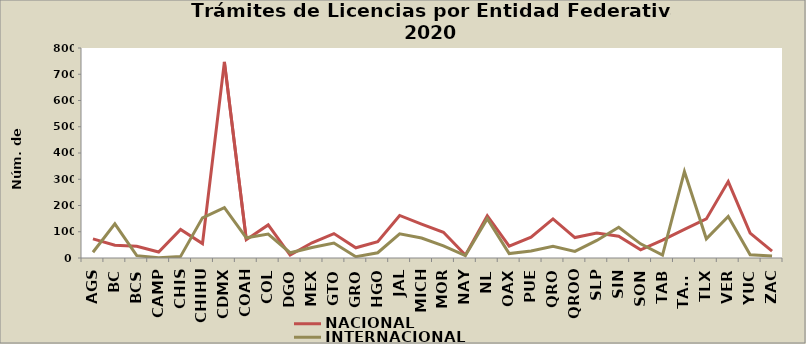
| Category | NACIONAL | INTERNACIONAL |
|---|---|---|
| AGS | 73 | 22 |
| BC | 49 | 130 |
| BCS | 45 | 9 |
| CAMP | 23 | 1 |
| CHIS | 109 | 6 |
| CHIHU | 55 | 153 |
| CDMX | 747 | 192 |
| COAH | 70 | 77 |
| COL | 126 | 91 |
| DGO | 11 | 20 |
| MEX | 58 | 40 |
| GTO | 93 | 57 |
| GRO | 39 | 5 |
| HGO | 62 | 20 |
| JAL | 162 | 92 |
| MICH | 129 | 76 |
| MOR | 98 | 46 |
| NAY | 11 | 9 |
| NL | 161 | 150 |
| OAX | 45 | 17 |
| PUE | 79 | 27 |
| QRO | 149 | 45 |
| QROO | 78 | 25 |
| SLP | 95 | 67 |
| SIN | 83 | 117 |
| SON | 31 | 54 |
| TAB | 68 | 11 |
| TAMS | 109 | 329 |
| TLX | 149 | 73 |
| VER | 291 | 158 |
| YUC | 95 | 12 |
| ZAC | 26 | 8 |